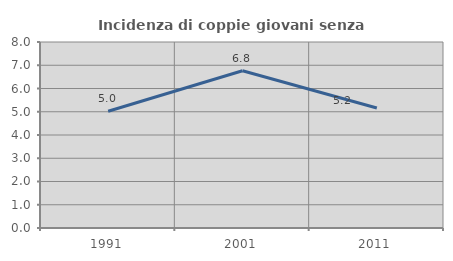
| Category | Incidenza di coppie giovani senza figli |
|---|---|
| 1991.0 | 5.021 |
| 2001.0 | 6.764 |
| 2011.0 | 5.164 |